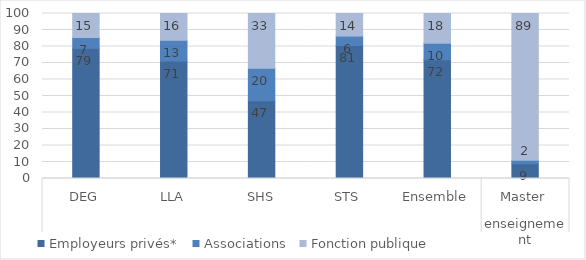
| Category | Employeurs privés* | Associations | Fonction publique |
|---|---|---|---|
| 0 | 78.89 | 6.57 | 14.54 |
| 1 | 71.13 | 12.63 | 16.24 |
| 2 | 47.19 | 19.6 | 33.21 |
| 3 | 80.63 | 5.68 | 13.69 |
| 4 | 72 | 10 | 18 |
| 5 | 9 | 2 | 89 |